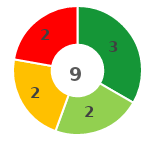
| Category | Series 0 |
|---|---|
| 0 | 3 |
| 1 | 2 |
| 2 | 2 |
| 3 | 2 |
| 4 | 0 |